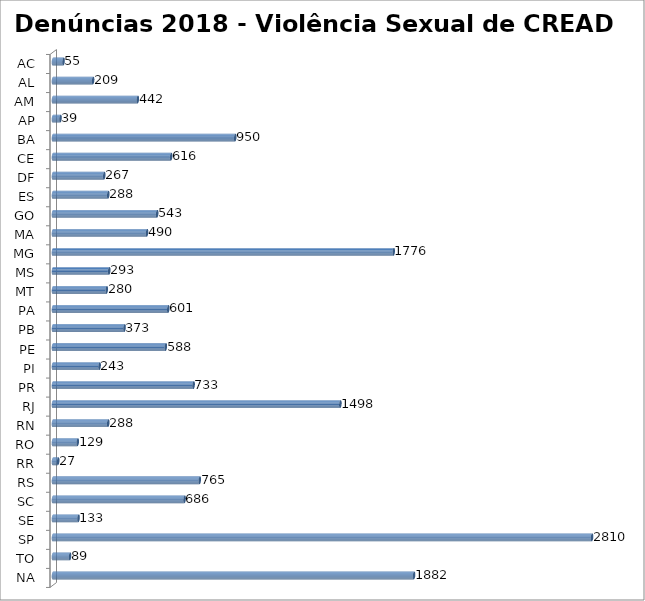
| Category | Series 0 |
|---|---|
| AC | 55 |
| AL | 209 |
| AM | 442 |
| AP | 39 |
| BA | 950 |
| CE | 616 |
| DF | 267 |
| ES | 288 |
| GO | 543 |
| MA | 490 |
| MG | 1776 |
| MS | 293 |
| MT | 280 |
| PA | 601 |
| PB | 373 |
| PE | 588 |
| PI | 243 |
| PR | 733 |
| RJ | 1498 |
| RN | 288 |
| RO | 129 |
| RR | 27 |
| RS | 765 |
| SC | 686 |
| SE | 133 |
| SP | 2810 |
| TO | 89 |
| NA | 1882 |